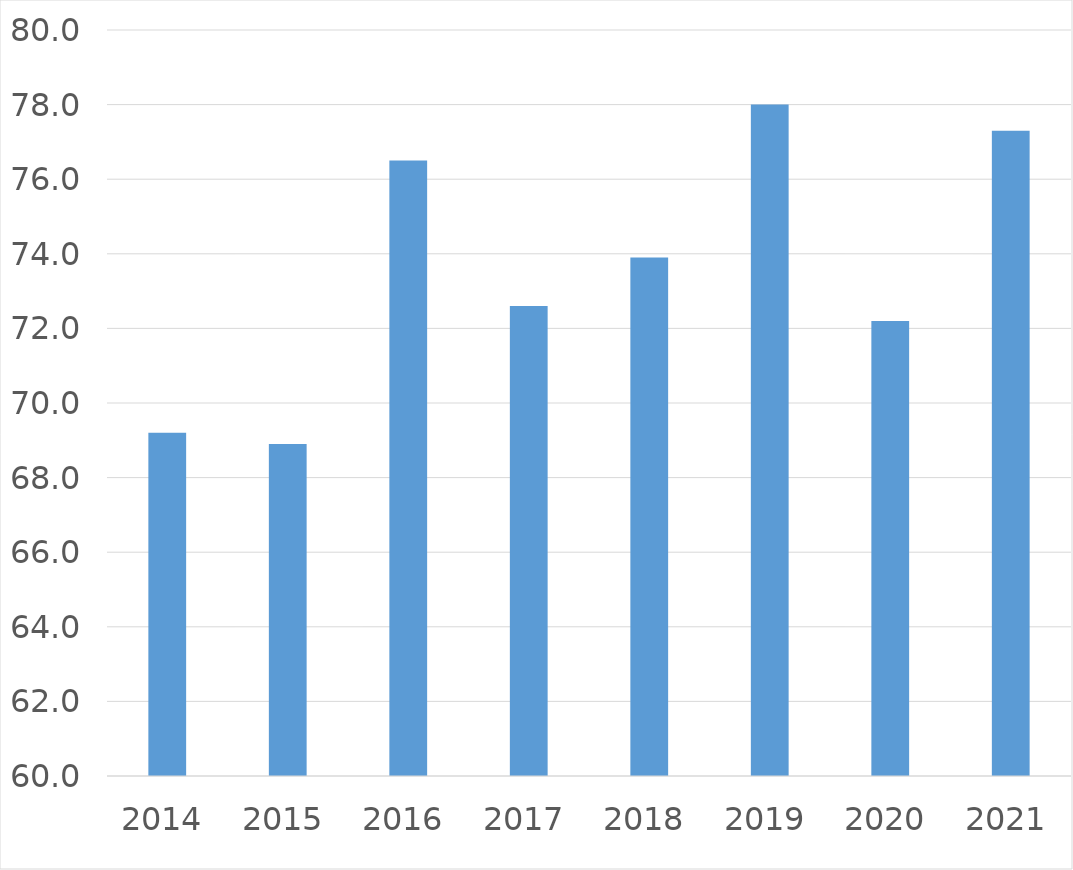
| Category | Series 0 |
|---|---|
| 2014 | 69.2 |
| 2015 | 68.9 |
| 2016 | 76.5 |
| 2017 | 72.6 |
| 2018 | 73.9 |
| 2019 | 78 |
| 2020 | 72.2 |
| 2021 | 77.3 |